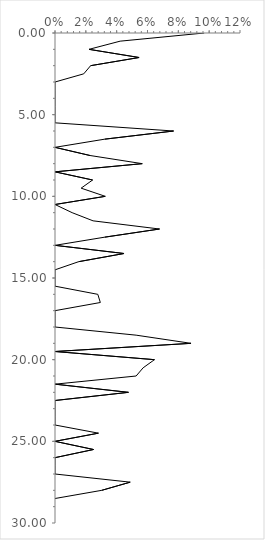
| Category | Series 0 |
|---|---|
| 0.0967741935483871 | 0 |
| 0.04225352112676056 | 0.5 |
| 0.022058823529411766 | 1 |
| 0.05454545454545454 | 1.5 |
| 0.023121387283236993 | 2 |
| 0.018633540372670808 | 2.5 |
| 0.0 | 3 |
| 0.0 | 3.5 |
| 0.0 | 4 |
| 0.0 | 4.5 |
| 0.0 | 5 |
| 0.0 | 5.5 |
| 0.07692307692307693 | 6 |
| 0.03225806451612903 | 6.5 |
| 0.0 | 7 |
| 0.022727272727272728 | 7.5 |
| 0.05660377358490566 | 8 |
| 0.0 | 8.5 |
| 0.024390243902439025 | 9 |
| 0.01694915254237288 | 9.5 |
| 0.03260869565217391 | 10 |
| 0.0 | 10.5 |
| 0.011111111111111112 | 11 |
| 0.024691358024691357 | 11.5 |
| 0.06779661016949153 | 12 |
| 0.03225806451612903 | 12.5 |
| 0.0 | 13 |
| 0.04477611940298507 | 13.5 |
| 0.015384615384615385 | 14 |
| 0.0 | 14.5 |
| 0.0 | 15 |
| 0.0 | 15.5 |
| 0.027777777777777776 | 16 |
| 0.029411764705882353 | 16.5 |
| 0.0 | 17 |
| 0.0 | 17.5 |
| 0.0 | 18 |
| 0.05263157894736842 | 18.5 |
| 0.08823529411764706 | 19 |
| 0.0 | 19.5 |
| 0.06451612903225806 | 20 |
| 0.05714285714285714 | 20.5 |
| 0.05263157894736842 | 21 |
| 0.0 | 21.5 |
| 0.047619047619047616 | 22 |
| 0.0 | 22.5 |
| 0.0 | 23 |
| 0.0 | 23.5 |
| 0.0 | 24 |
| 0.028169014084507043 | 24.5 |
| 0.0 | 25 |
| 0.025 | 25.5 |
| 0.0 | 26 |
| 0.0 | 26.5 |
| 0.0 | 27 |
| 0.04878048780487805 | 27.5 |
| 0.030303030303030304 | 28 |
| 0.0 | 28.5 |